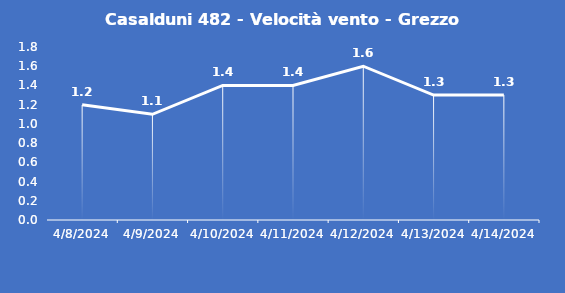
| Category | Casalduni 482 - Velocità vento - Grezzo (m/s) |
|---|---|
| 4/8/24 | 1.2 |
| 4/9/24 | 1.1 |
| 4/10/24 | 1.4 |
| 4/11/24 | 1.4 |
| 4/12/24 | 1.6 |
| 4/13/24 | 1.3 |
| 4/14/24 | 1.3 |